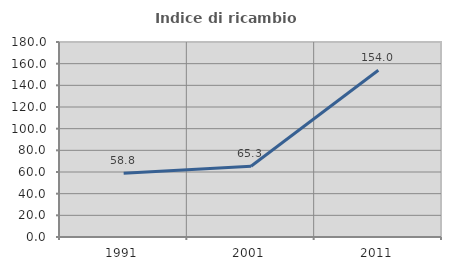
| Category | Indice di ricambio occupazionale  |
|---|---|
| 1991.0 | 58.81 |
| 2001.0 | 65.306 |
| 2011.0 | 153.979 |